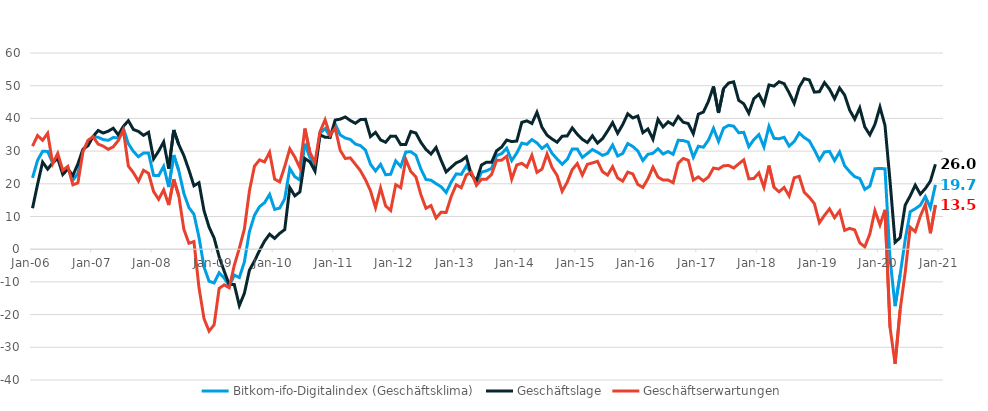
| Category | Bitkom-ifo-Digitalindex (Geschäftsklima) | Geschäftslage | Geschäftserwartungen |
|---|---|---|---|
| 2006-01-01 | 21.81 | 12.53 | 31.51 |
| 2006-02-01 | 27.18 | 19.85 | 34.76 |
| 2006-03-01 | 29.95 | 26.64 | 33.31 |
| 2006-04-01 | 29.9 | 24.48 | 35.46 |
| 2006-05-01 | 26.32 | 26.4 | 26.23 |
| 2006-06-01 | 28.53 | 27.79 | 29.28 |
| 2006-07-01 | 23.47 | 22.84 | 24.09 |
| 2006-08-01 | 24.91 | 24.5 | 25.33 |
| 2006-09-01 | 21.11 | 22.53 | 19.7 |
| 2006-10-01 | 23.16 | 26.1 | 20.27 |
| 2006-11-01 | 30.22 | 30.58 | 29.86 |
| 2006-12-01 | 32.48 | 31.65 | 33.3 |
| 2007-01-01 | 34.45 | 34.48 | 34.42 |
| 2007-02-01 | 34.21 | 36.29 | 32.14 |
| 2007-03-01 | 33.53 | 35.53 | 31.54 |
| 2007-04-01 | 33.29 | 36.08 | 30.54 |
| 2007-05-01 | 34.14 | 36.99 | 31.32 |
| 2007-06-01 | 34.07 | 34.93 | 33.22 |
| 2007-07-01 | 37.01 | 37.55 | 36.46 |
| 2007-08-01 | 32.26 | 39.3 | 25.42 |
| 2007-09-01 | 29.9 | 36.6 | 23.4 |
| 2007-10-01 | 28.28 | 36.02 | 20.8 |
| 2007-11-01 | 29.42 | 34.83 | 24.14 |
| 2007-12-01 | 29.39 | 35.74 | 23.2 |
| 2008-01-01 | 22.58 | 27.62 | 17.64 |
| 2008-02-01 | 22.5 | 29.98 | 15.26 |
| 2008-03-01 | 25.36 | 32.81 | 18.14 |
| 2008-04-01 | 19 | 24.65 | 13.5 |
| 2008-05-01 | 28.79 | 36.45 | 21.38 |
| 2008-06-01 | 24 | 31.97 | 16.31 |
| 2008-07-01 | 17.08 | 28.64 | 6.1 |
| 2008-08-01 | 12.75 | 24.25 | 1.83 |
| 2008-09-01 | 10.7 | 19.4 | 2.34 |
| 2008-10-01 | 3.67 | 20.32 | -11.72 |
| 2008-11-01 | -5.44 | 11.78 | -21.26 |
| 2008-12-01 | -9.8 | 6.77 | -25.05 |
| 2009-01-01 | -10.32 | 3.42 | -23.12 |
| 2009-02-01 | -7.21 | -2.33 | -11.98 |
| 2009-03-01 | -8.84 | -6.74 | -10.91 |
| 2009-04-01 | -11.31 | -10.83 | -11.79 |
| 2009-05-01 | -7.9 | -10.83 | -4.93 |
| 2009-06-01 | -8.67 | -17.24 | 0.3 |
| 2009-07-01 | -3.9 | -13.49 | 6.18 |
| 2009-08-01 | 5.36 | -6.41 | 17.85 |
| 2009-09-01 | 10.38 | -3.62 | 25.38 |
| 2009-10-01 | 13 | -0.4 | 27.31 |
| 2009-11-01 | 14.23 | 2.47 | 26.68 |
| 2009-12-01 | 16.75 | 4.58 | 29.64 |
| 2010-01-01 | 12.18 | 3.3 | 21.44 |
| 2010-02-01 | 12.58 | 4.85 | 20.6 |
| 2010-03-01 | 15.42 | 5.99 | 25.28 |
| 2010-04-01 | 24.68 | 18.84 | 30.69 |
| 2010-05-01 | 22.17 | 16.32 | 28.18 |
| 2010-06-01 | 21.17 | 17.51 | 24.9 |
| 2010-07-01 | 32.26 | 27.72 | 36.9 |
| 2010-08-01 | 28.12 | 26.71 | 29.53 |
| 2010-09-01 | 25.23 | 23.87 | 26.59 |
| 2010-10-01 | 35.47 | 34.97 | 35.97 |
| 2010-11-01 | 36.89 | 34.25 | 39.57 |
| 2010-12-01 | 34.48 | 34.16 | 34.81 |
| 2011-01-01 | 38.29 | 39.49 | 37.09 |
| 2011-02-01 | 34.95 | 39.77 | 30.23 |
| 2011-03-01 | 34 | 40.44 | 27.74 |
| 2011-04-01 | 33.56 | 39.35 | 27.92 |
| 2011-05-01 | 32.16 | 38.5 | 25.99 |
| 2011-06-01 | 31.68 | 39.63 | 24.01 |
| 2011-07-01 | 30.32 | 39.72 | 21.28 |
| 2011-08-01 | 26 | 34.44 | 17.87 |
| 2011-09-01 | 23.92 | 35.72 | 12.71 |
| 2011-10-01 | 25.95 | 33.41 | 18.73 |
| 2011-11-01 | 22.77 | 32.71 | 13.25 |
| 2011-12-01 | 22.92 | 34.58 | 11.84 |
| 2012-01-01 | 27.02 | 34.56 | 19.73 |
| 2012-02-01 | 25.3 | 31.98 | 18.81 |
| 2012-03-01 | 29.73 | 32.04 | 27.45 |
| 2012-04-01 | 29.79 | 36 | 23.74 |
| 2012-05-01 | 28.72 | 35.51 | 22.12 |
| 2012-06-01 | 24.51 | 32.66 | 16.64 |
| 2012-07-01 | 21.32 | 30.51 | 12.51 |
| 2012-08-01 | 21.09 | 29.11 | 13.35 |
| 2012-09-01 | 20.05 | 31.11 | 9.53 |
| 2012-10-01 | 19.1 | 27.17 | 11.31 |
| 2012-11-01 | 17.34 | 23.63 | 11.22 |
| 2012-12-01 | 20.54 | 25.05 | 16.12 |
| 2013-01-01 | 23.03 | 26.41 | 19.71 |
| 2013-02-01 | 22.88 | 27.07 | 18.78 |
| 2013-03-01 | 25.46 | 28.27 | 22.69 |
| 2013-04-01 | 23.15 | 22.77 | 23.54 |
| 2013-05-01 | 20.24 | 20.94 | 19.54 |
| 2013-06-01 | 23.54 | 25.73 | 21.37 |
| 2013-07-01 | 23.99 | 26.62 | 21.39 |
| 2013-08-01 | 24.7 | 26.56 | 22.86 |
| 2013-09-01 | 28.64 | 30.1 | 27.19 |
| 2013-10-01 | 29.22 | 31.23 | 27.23 |
| 2013-11-01 | 30.89 | 33.38 | 28.42 |
| 2013-12-01 | 27.1 | 32.91 | 21.43 |
| 2014-01-01 | 29.39 | 33.07 | 25.76 |
| 2014-02-01 | 32.45 | 38.79 | 26.28 |
| 2014-03-01 | 32.08 | 39.25 | 25.13 |
| 2014-04-01 | 33.53 | 38.45 | 28.72 |
| 2014-05-01 | 32.5 | 41.86 | 23.51 |
| 2014-06-01 | 30.79 | 37.29 | 24.47 |
| 2014-07-01 | 31.97 | 34.87 | 29.12 |
| 2014-08-01 | 29.3 | 33.69 | 24.98 |
| 2014-09-01 | 27.57 | 32.71 | 22.54 |
| 2014-10-01 | 25.97 | 34.55 | 17.7 |
| 2014-11-01 | 27.45 | 34.64 | 20.49 |
| 2014-12-01 | 30.63 | 37.09 | 24.34 |
| 2015-01-01 | 30.63 | 35.15 | 26.2 |
| 2015-02-01 | 28.05 | 33.59 | 22.65 |
| 2015-03-01 | 29.27 | 32.62 | 25.97 |
| 2015-04-01 | 30.48 | 34.66 | 26.38 |
| 2015-05-01 | 29.66 | 32.46 | 26.89 |
| 2015-06-01 | 28.69 | 33.79 | 23.71 |
| 2015-07-01 | 29.3 | 36.14 | 22.66 |
| 2015-08-01 | 31.87 | 38.7 | 25.24 |
| 2015-09-01 | 28.51 | 35.45 | 21.78 |
| 2015-10-01 | 29.29 | 38.09 | 20.81 |
| 2015-11-01 | 32.31 | 41.4 | 23.57 |
| 2015-12-01 | 31.42 | 40.14 | 23.02 |
| 2016-01-01 | 30.03 | 40.73 | 19.8 |
| 2016-02-01 | 27.11 | 35.63 | 18.89 |
| 2016-03-01 | 29.02 | 36.78 | 21.52 |
| 2016-04-01 | 29.33 | 33.64 | 25.1 |
| 2016-05-01 | 30.72 | 39.72 | 22.06 |
| 2016-06-01 | 29.11 | 37.37 | 21.14 |
| 2016-07-01 | 29.88 | 38.96 | 21.15 |
| 2016-08-01 | 29 | 38.01 | 20.32 |
| 2016-09-01 | 33.31 | 40.58 | 26.25 |
| 2016-10-01 | 33.23 | 38.83 | 27.76 |
| 2016-11-01 | 32.74 | 38.42 | 27.19 |
| 2016-12-01 | 28.13 | 35.32 | 21.15 |
| 2017-01-01 | 31.49 | 41.28 | 22.11 |
| 2017-02-01 | 31.18 | 41.94 | 20.89 |
| 2017-03-01 | 33.37 | 45.22 | 22.09 |
| 2017-04-01 | 36.97 | 49.77 | 24.82 |
| 2017-05-01 | 32.95 | 41.68 | 24.53 |
| 2017-06-01 | 37.02 | 49.11 | 25.51 |
| 2017-07-01 | 37.88 | 50.83 | 25.6 |
| 2017-08-01 | 37.63 | 51.18 | 24.81 |
| 2017-09-01 | 35.61 | 45.53 | 26.09 |
| 2017-10-01 | 35.74 | 44.47 | 27.33 |
| 2017-11-01 | 31.34 | 41.58 | 21.54 |
| 2017-12-01 | 33.5 | 46.02 | 21.61 |
| 2018-01-01 | 35.05 | 47.38 | 23.34 |
| 2018-02-01 | 31.28 | 44.34 | 18.92 |
| 2018-03-01 | 37.58 | 50.23 | 25.57 |
| 2018-04-01 | 33.9 | 49.88 | 18.93 |
| 2018-05-01 | 33.77 | 51.21 | 17.54 |
| 2018-06-01 | 34.22 | 50.62 | 18.89 |
| 2018-07-01 | 31.53 | 47.83 | 16.3 |
| 2018-08-01 | 32.95 | 44.6 | 21.85 |
| 2018-09-01 | 35.53 | 49.57 | 22.28 |
| 2018-10-01 | 34.12 | 52.15 | 17.38 |
| 2018-11-01 | 33.13 | 51.75 | 15.89 |
| 2018-12-01 | 30.36 | 48.04 | 13.94 |
| 2019-01-01 | 27.26 | 48.17 | 8.11 |
| 2019-02-01 | 29.74 | 50.95 | 10.33 |
| 2019-03-01 | 29.91 | 48.96 | 12.33 |
| 2019-04-01 | 27.09 | 46 | 9.63 |
| 2019-05-01 | 29.72 | 49.3 | 11.68 |
| 2019-06-01 | 25.5 | 47.14 | 5.76 |
| 2019-07-01 | 23.71 | 42.51 | 6.37 |
| 2019-08-01 | 22.19 | 39.77 | 5.89 |
| 2019-09-01 | 21.62 | 43.2 | 1.95 |
| 2019-10-01 | 18.28 | 37.37 | 0.72 |
| 2019-11-01 | 19.3 | 34.98 | 4.68 |
| 2019-12-01 | 24.59 | 38.16 | 11.8 |
| 2020-01-01 | 24.72 | 43.47 | 7.41 |
| 2020-02-01 | 24.58 | 37.85 | 12.04 |
| 2020-03-01 | -2.83 | 20.82 | -23.94 |
| 2020-04-01 | -17.41 | 2.1 | -35.04 |
| 2020-05-01 | -7.84 | 3.51 | -18.56 |
| 2020-06-01 | 2.9 | 13.46 | -7.15 |
| 2020-07-01 | 11.46 | 16.31 | 6.71 |
| 2020-08-01 | 12.36 | 19.59 | 5.38 |
| 2020-09-01 | 13.43 | 16.84 | 10.07 |
| 2020-10-01 | 16.1 | 18.54 | 13.7 |
| 2020-11-01 | 12.69 | 20.82 | 4.87 |
| 2020-12-01 | 19.65 | 25.96 | 13.51 |